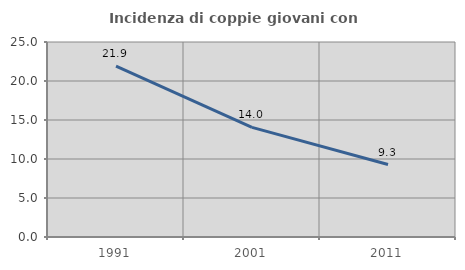
| Category | Incidenza di coppie giovani con figli |
|---|---|
| 1991.0 | 21.913 |
| 2001.0 | 14.048 |
| 2011.0 | 9.292 |